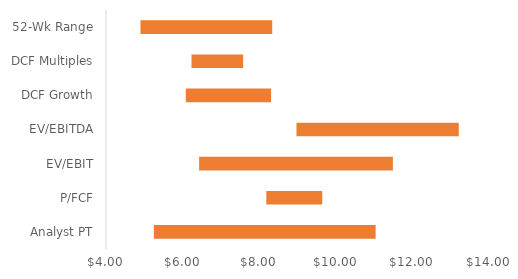
| Category | Q1 | Spread |
|---|---|---|
| Analyst PT | 5.25 | 5.79 |
| P/FCF | 8.186 | 1.46 |
| EV/EBIT | 6.431 | 5.06 |
| EV/EBITDA | 8.974 | 4.237 |
| DCF Growth | 6.084 | 2.226 |
| DCF Multiples | 6.233 | 1.348 |
| 52-Wk Range | 4.9 | 3.44 |